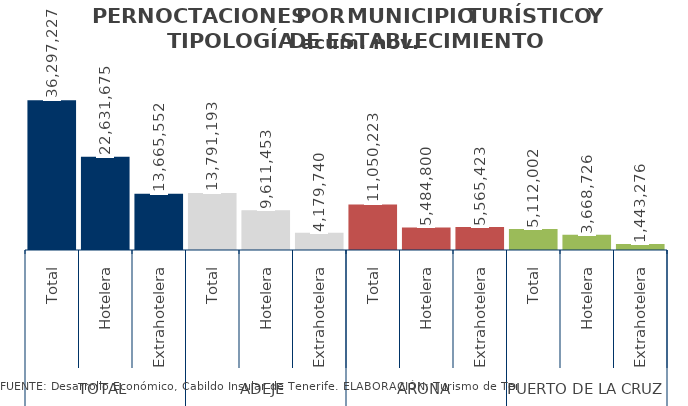
| Category | acum. nov. 2014 |
|---|---|
| 0 | 36297227 |
| 1 | 22631675 |
| 2 | 13665552 |
| 3 | 13791193 |
| 4 | 9611453 |
| 5 | 4179740 |
| 6 | 11050223 |
| 7 | 5484800 |
| 8 | 5565423 |
| 9 | 5112002 |
| 10 | 3668726 |
| 11 | 1443276 |